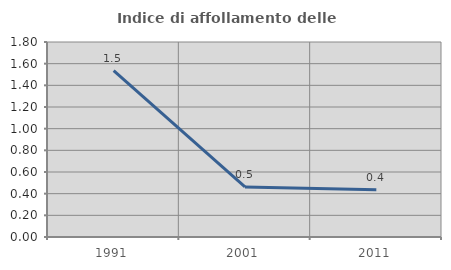
| Category | Indice di affollamento delle abitazioni  |
|---|---|
| 1991.0 | 1.535 |
| 2001.0 | 0.463 |
| 2011.0 | 0.435 |